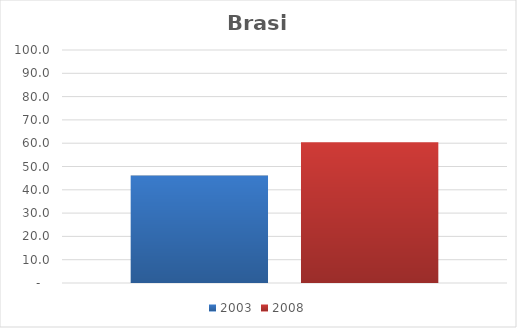
| Category | 2003 | 2008 |
|---|---|---|
| Total | 46.1 | 60.4 |